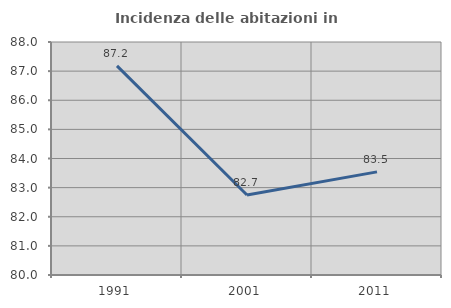
| Category | Incidenza delle abitazioni in proprietà  |
|---|---|
| 1991.0 | 87.179 |
| 2001.0 | 82.749 |
| 2011.0 | 83.54 |